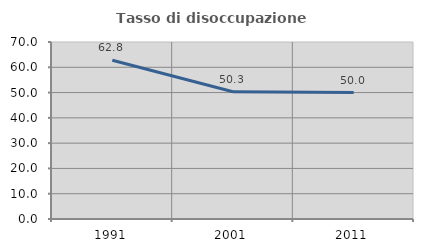
| Category | Tasso di disoccupazione giovanile  |
|---|---|
| 1991.0 | 62.808 |
| 2001.0 | 50.311 |
| 2011.0 | 50 |